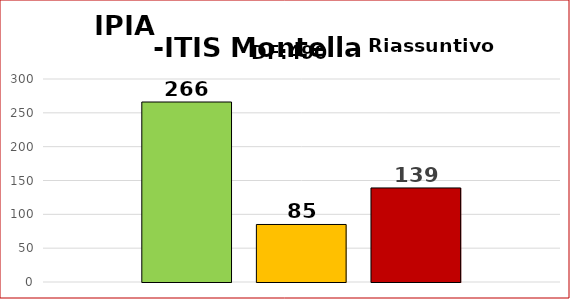
| Category | SUPERATI | PARZIAL.NTE SUPERATI | NON SUPERATI |
|---|---|---|---|
| 0 | 266 | 85 | 139 |